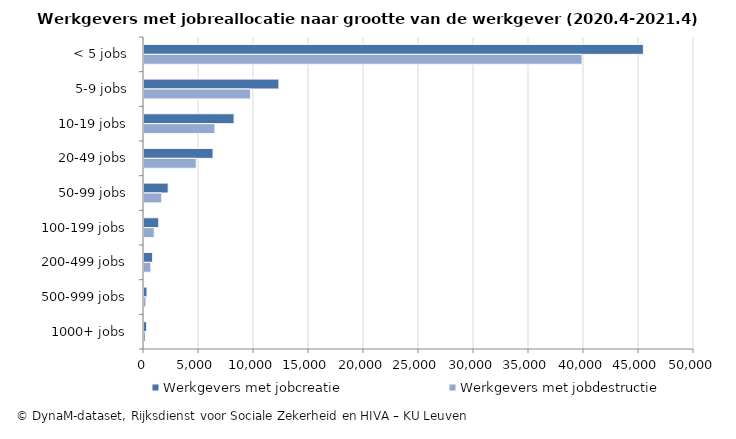
| Category | Werkgevers met jobcreatie | Werkgevers met jobdestructie |
|---|---|---|
| < 5 jobs | 45398 | 39824 |
| 5-9 jobs | 12263 | 9693 |
| 10-19 jobs | 8190 | 6444 |
| 20-49 jobs | 6278 | 4748 |
| 50-99 jobs | 2200 | 1612 |
| 100-199 jobs | 1342 | 929 |
| 200-499 jobs | 786 | 626 |
| 500-999 jobs | 272 | 178 |
| 1000+ jobs | 244 | 141 |